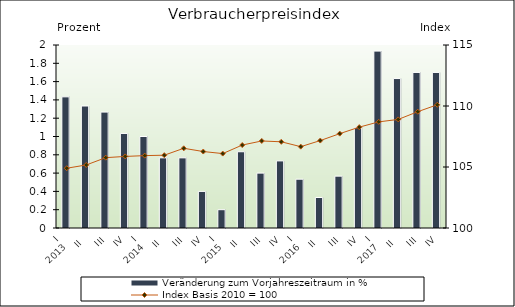
| Category | Veränderung zum Vorjahreszeitraum in % |
|---|---|
| 0 | 1.433 |
| 1 | 1.333 |
| 2 | 1.267 |
| 3 | 1.033 |
| 4 | 1 |
| 5 | 0.767 |
| 6 | 0.767 |
| 7 | 0.4 |
| 8 | 0.2 |
| 9 | 0.833 |
| 10 | 0.6 |
| 11 | 0.733 |
| 12 | 0.533 |
| 13 | 0.333 |
| 14 | 0.567 |
| 15 | 1.1 |
| 16 | 1.933 |
| 17 | 1.633 |
| 18 | 1.7 |
| 19 | 1.7 |